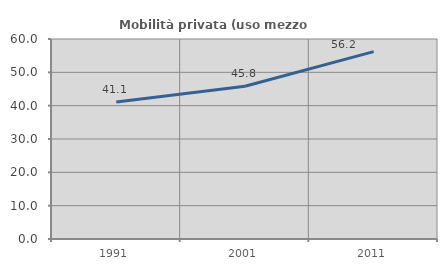
| Category | Mobilità privata (uso mezzo privato) |
|---|---|
| 1991.0 | 41.127 |
| 2001.0 | 45.843 |
| 2011.0 | 56.22 |